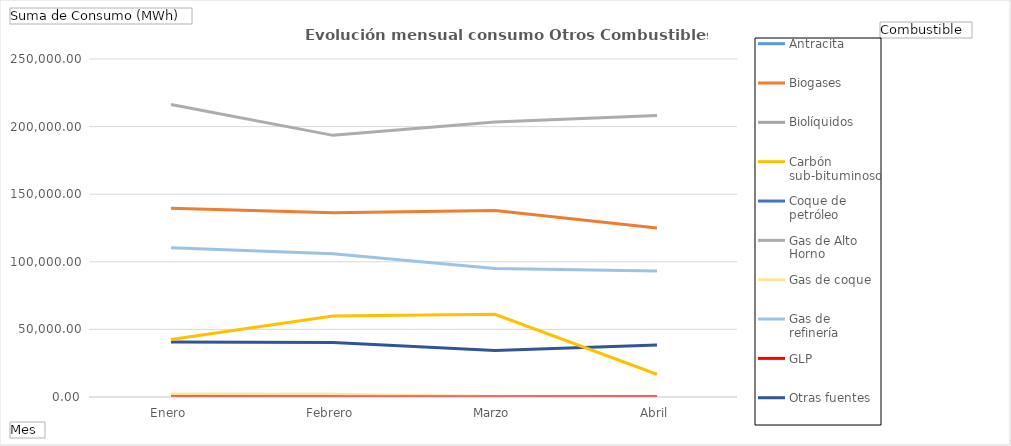
| Category | Antracita | Biogases | Biolíquidos | Carbón sub-bituminoso | Coque de petróleo | Gas de Alto Horno | Gas de coque | Gas de refinería | GLP | Otras fuentes | Residuos industriales no renovables |
|---|---|---|---|---|---|---|---|---|---|---|---|
| Enero | 0 | 47632.3 | 0 | 0 | 0 | 74745.43 | 720.6 | 33458.85 | 0 | 11799.42 | 6631.76 |
| Febrero | 0 | 46605.35 | 0 | 0 | 0 | 65315.19 | 629.99 | 32266.94 | 0 | 12436.26 | 5245.29 |
| Marzo | 0 | 47047.55 | 0 | 0 | 0 | 68303.02 | 103.04 | 28557.85 | 0.05 | 9973.56 | 2240.06 |
| Abril | 0 | 42363.2 | 0 | 0 | 0 | 70065.05 | 6.31 | 27913.04 | 8.97 | 11056.05 | 1894.04 |